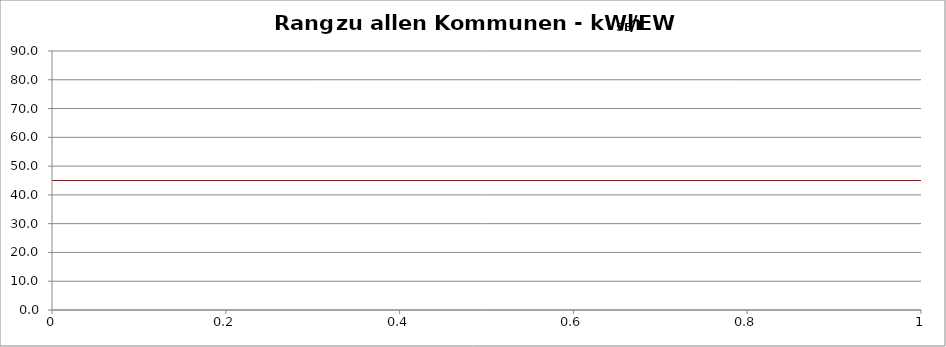
| Category | Kommunenrangfolge |
|---|---|
| 0 | 3.121 |
| 1 | 3.6 |
| 2 | 5.123 |
| 3 | 5.89 |
| 4 | 6.032 |
| 5 | 6.786 |
| 6 | 7.464 |
| 7 | 7.67 |
| 8 | 7.769 |
| 9 | 7.902 |
| 10 | 8.016 |
| 11 | 8.079 |
| 12 | 8.087 |
| 13 | 8.131 |
| 14 | 8.207 |
| 15 | 8.286 |
| 16 | 8.322 |
| 17 | 8.375 |
| 18 | 8.523 |
| 19 | 8.582 |
| 20 | 8.586 |
| 21 | 8.608 |
| 22 | 9.004 |
| 23 | 9.153 |
| 24 | 9.238 |
| 25 | 9.382 |
| 26 | 9.523 |
| 27 | 9.622 |
| 28 | 9.706 |
| 29 | 9.955 |
| 30 | 9.971 |
| 31 | 9.985 |
| 32 | 10.457 |
| 33 | 10.806 |
| 34 | 10.874 |
| 35 | 10.909 |
| 36 | 11.109 |
| 37 | 11.191 |
| 38 | 11.39 |
| 39 | 11.664 |
| 40 | 11.74 |
| 41 | 11.801 |
| 42 | 11.84 |
| 43 | 11.929 |
| 44 | 11.972 |
| 45 | 11.994 |
| 46 | 12.029 |
| 47 | 12.166 |
| 48 | 12.324 |
| 49 | 12.342 |
| 50 | 12.39 |
| 51 | 12.568 |
| 52 | 12.637 |
| 53 | 12.74 |
| 54 | 12.785 |
| 55 | 12.811 |
| 56 | 12.946 |
| 57 | 12.959 |
| 58 | 13.048 |
| 59 | 13.076 |
| 60 | 13.091 |
| 61 | 13.191 |
| 62 | 13.259 |
| 63 | 13.285 |
| 64 | 13.301 |
| 65 | 13.414 |
| 66 | 13.457 |
| 67 | 13.534 |
| 68 | 13.534 |
| 69 | 13.554 |
| 70 | 13.567 |
| 71 | 13.63 |
| 72 | 13.721 |
| 73 | 13.796 |
| 74 | 13.797 |
| 75 | 13.876 |
| 76 | 13.926 |
| 77 | 13.99 |
| 78 | 13.997 |
| 79 | 14.019 |
| 80 | 14.079 |
| 81 | 14.208 |
| 82 | 14.297 |
| 83 | 14.402 |
| 84 | 14.428 |
| 85 | 14.444 |
| 86 | 14.462 |
| 87 | 14.564 |
| 88 | 14.726 |
| 89 | 14.754 |
| 90 | 14.779 |
| 91 | 14.988 |
| 92 | 14.992 |
| 93 | 15.032 |
| 94 | 15.231 |
| 95 | 15.248 |
| 96 | 15.253 |
| 97 | 15.351 |
| 98 | 15.397 |
| 99 | 15.424 |
| 100 | 15.443 |
| 101 | 15.451 |
| 102 | 15.612 |
| 103 | 15.691 |
| 104 | 15.712 |
| 105 | 15.744 |
| 106 | 15.845 |
| 107 | 15.935 |
| 108 | 15.952 |
| 109 | 15.956 |
| 110 | 16.127 |
| 111 | 16.197 |
| 112 | 16.213 |
| 113 | 16.259 |
| 114 | 16.489 |
| 115 | 16.492 |
| 116 | 16.493 |
| 117 | 16.763 |
| 118 | 16.777 |
| 119 | 16.888 |
| 120 | 16.948 |
| 121 | 17.041 |
| 122 | 17.043 |
| 123 | 17.138 |
| 124 | 17.298 |
| 125 | 17.299 |
| 126 | 17.371 |
| 127 | 17.375 |
| 128 | 17.511 |
| 129 | 17.547 |
| 130 | 17.673 |
| 131 | 17.845 |
| 132 | 17.905 |
| 133 | 17.928 |
| 134 | 17.989 |
| 135 | 18.027 |
| 136 | 18.08 |
| 137 | 18.47 |
| 138 | 18.504 |
| 139 | 18.526 |
| 140 | 18.629 |
| 141 | 18.723 |
| 142 | 18.789 |
| 143 | 18.885 |
| 144 | 18.916 |
| 145 | 19.337 |
| 146 | 19.395 |
| 147 | 19.402 |
| 148 | 19.566 |
| 149 | 19.605 |
| 150 | 19.66 |
| 151 | 19.664 |
| 152 | 19.757 |
| 153 | 20.015 |
| 154 | 20.257 |
| 155 | 20.263 |
| 156 | 20.567 |
| 157 | 20.597 |
| 158 | 20.63 |
| 159 | 21.162 |
| 160 | 21.167 |
| 161 | 21.639 |
| 162 | 21.687 |
| 163 | 21.952 |
| 164 | 21.985 |
| 165 | 22.368 |
| 166 | 22.618 |
| 167 | 22.662 |
| 168 | 22.696 |
| 169 | 23.527 |
| 170 | 23.603 |
| 171 | 23.648 |
| 172 | 24.08 |
| 173 | 24.241 |
| 174 | 24.27 |
| 175 | 24.301 |
| 176 | 24.388 |
| 177 | 25.115 |
| 178 | 25.281 |
| 179 | 25.35 |
| 180 | 25.61 |
| 181 | 26.104 |
| 182 | 26.975 |
| 183 | 27.277 |
| 184 | 28.043 |
| 185 | 28.173 |
| 186 | 28.257 |
| 187 | 28.383 |
| 188 | 30.059 |
| 189 | 31.809 |
| 190 | 31.964 |
| 191 | 32.018 |
| 192 | 33.645 |
| 193 | 44.161 |
| 194 | 61.339 |
| 195 | 62.305 |
| 196 | 64.898 |
| 197 | 65.332 |
| 198 | 83.087 |